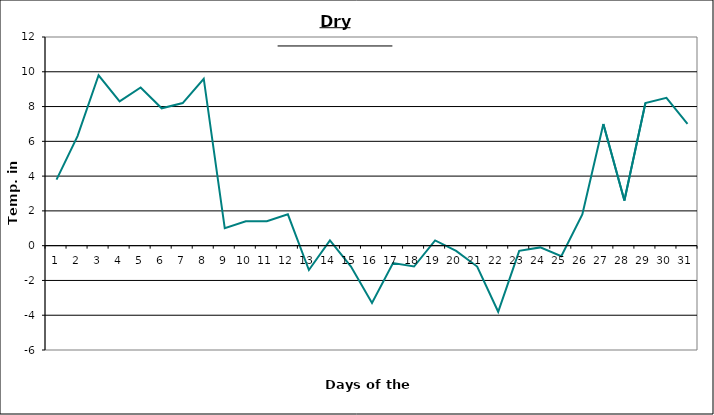
| Category | Series 0 |
|---|---|
| 0 | 3.8 |
| 1 | 6.3 |
| 2 | 9.8 |
| 3 | 8.3 |
| 4 | 9.1 |
| 5 | 7.9 |
| 6 | 8.2 |
| 7 | 9.6 |
| 8 | 1 |
| 9 | 1.4 |
| 10 | 1.4 |
| 11 | 1.8 |
| 12 | -1.4 |
| 13 | 0.3 |
| 14 | -1.2 |
| 15 | -3.3 |
| 16 | -1 |
| 17 | -1.2 |
| 18 | 0.3 |
| 19 | -0.3 |
| 20 | -1.2 |
| 21 | -3.8 |
| 22 | -0.3 |
| 23 | -0.1 |
| 24 | -0.6 |
| 25 | 1.8 |
| 26 | 7 |
| 27 | 2.6 |
| 28 | 8.2 |
| 29 | 8.5 |
| 30 | 7 |